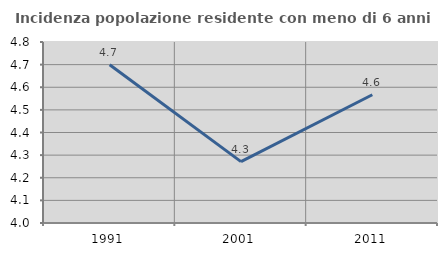
| Category | Incidenza popolazione residente con meno di 6 anni |
|---|---|
| 1991.0 | 4.7 |
| 2001.0 | 4.271 |
| 2011.0 | 4.567 |